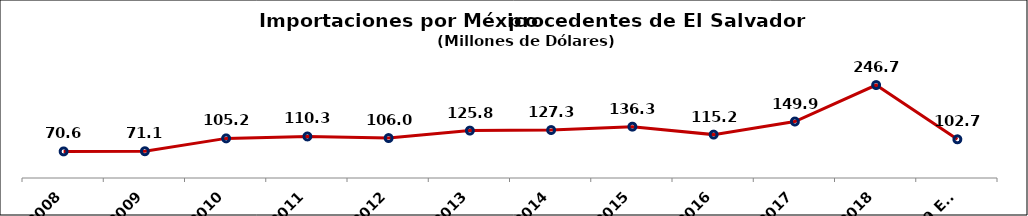
| Category | Series 0 |
|---|---|
| 2008 | 70.553 |
| 2009 | 71.058 |
| 2010 | 105.183 |
| 2011 | 110.254 |
| 2012 | 106.014 |
| 2013 | 125.829 |
| 2014 | 127.293 |
| 2015 | 136.314 |
| 2016 | 115.182 |
| 2017 | 149.9 |
| 2018 | 246.7 |
| 2019 Enero-Mayo | 102.7 |